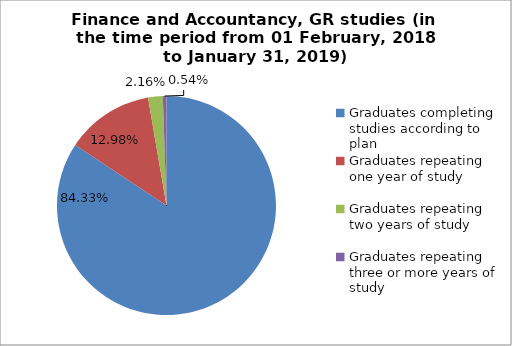
| Category | Series 0 |
|---|---|
| Graduates completing studies according to plan | 84.324 |
| Graduates repeating one year of study | 12.973 |
| Graduates repeating two years of study | 2.162 |
| Graduates repeating three or more years of study | 0.541 |